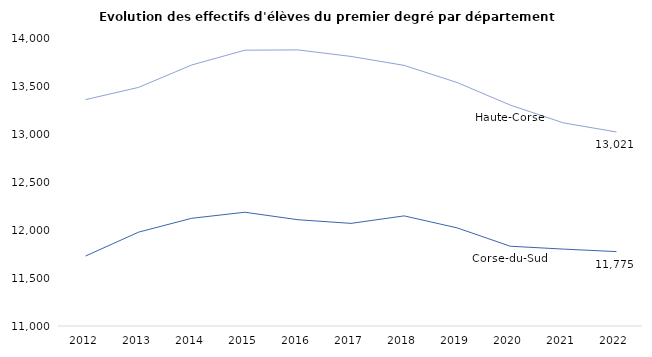
| Category | Corse-du-Sud | Haute-Corse |
|---|---|---|
| 2012 | 11729 | 13358 |
| 2013 | 11978 | 13486 |
| 2014 | 12122 | 13719 |
| 2015 | 12185 | 13873 |
| 2016 | 12107 | 13876 |
| 2017 | 12069 | 13808 |
| 2018 | 12147 | 13715 |
| 2019 | 12022 | 13536 |
| 2020 | 11831 | 13301 |
| 2021 | 11801 | 13116 |
| 2022 | 11775 | 13021 |